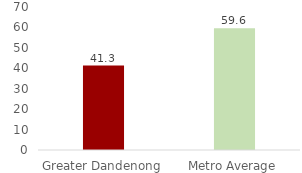
| Category | Series 0 |
|---|---|
| Greater Dandenong | 41.31 |
| Metro Average | 59.628 |